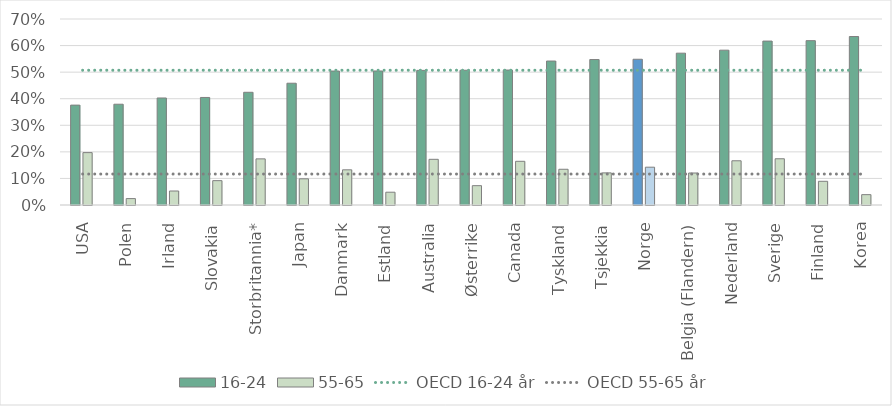
| Category | 16-24 | 55-65 |
|---|---|---|
| USA | 0.376 | 0.197 |
| Polen | 0.379 | 0.024 |
| Irland | 0.403 | 0.053 |
| Slovakia | 0.405 | 0.092 |
| Storbritannia* | 0.424 | 0.174 |
| Japan | 0.458 | 0.099 |
| Danmark | 0.504 | 0.132 |
| Estland | 0.504 | 0.048 |
| Australia | 0.507 | 0.172 |
| Østerrike | 0.507 | 0.073 |
| Canada | 0.508 | 0.164 |
| Tyskland | 0.542 | 0.134 |
| Tsjekkia | 0.547 | 0.121 |
| Norge | 0.549 | 0.142 |
| Belgia (Flandern) | 0.571 | 0.12 |
| Nederland | 0.583 | 0.166 |
| Sverige | 0.617 | 0.174 |
| Finland | 0.619 | 0.089 |
| Korea | 0.634 | 0.039 |